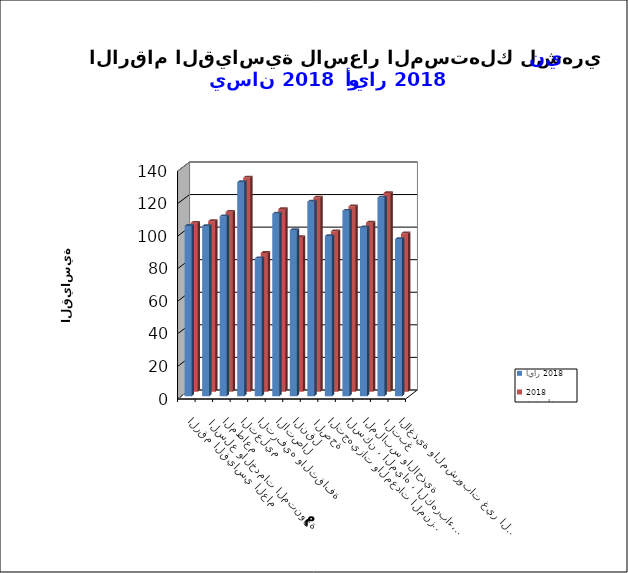
| Category | آيار 2018      | نيسان 2018       |
|---|---|---|
| الاغذية والمشروبات غير الكحولية | 96.5 | 97.2 |
|  التبغ | 122 | 122 |
| الملابس والاحذية | 103.7 | 103.8 |
| السكن ، المياه ، الكهرباء، الغاز  | 113.9 | 113.8 |
| التجهيزات والمعدات المنزلية والصيانة | 98.4 | 98.5 |
|  الصحة | 119.5 | 119.2 |
| النقل | 102 | 95 |
| الاتصال | 112.1 | 112.2 |
| الترفيه والثقافة | 84.7 | 85.2 |
| التعليم | 131.5 | 131.5 |
| المطاعم  | 110.5 | 110.5 |
|  السلع والخدمات المتنوعة | 104.5 | 104.7 |
| الرقم القياسي العام | 104.6 | 103.7 |